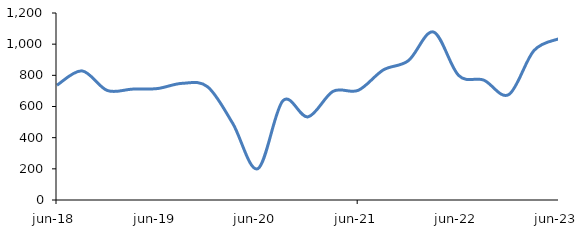
| Category | Series 0 |
|---|---|
| 2018-06-01 | 736.757 |
| 2018-09-01 | 828.459 |
| 2018-12-01 | 703.018 |
| 2019-03-01 | 711.457 |
| 2019-06-01 | 715.132 |
| 2019-09-01 | 748.822 |
| 2019-12-01 | 726.476 |
| 2020-03-01 | 492.046 |
| 2020-06-01 | 200.975 |
| 2020-09-01 | 636.87 |
| 2020-12-01 | 533.568 |
| 2021-03-01 | 697.562 |
| 2021-06-01 | 703.692 |
| 2021-09-01 | 834.523 |
| 2021-12-01 | 894.112 |
| 2022-03-01 | 1077.997 |
| 2022-06-01 | 799.559 |
| 2022-09-01 | 769.5 |
| 2022-12-01 | 676.558 |
| 2023-03-01 | 958.666 |
| 2023-06-01 | 1035.151 |